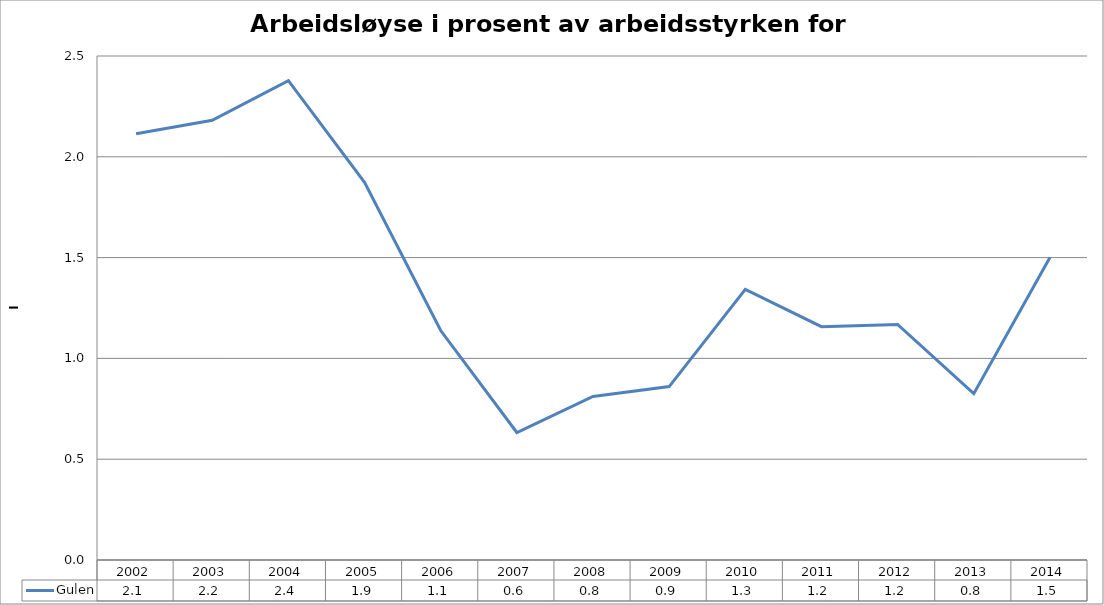
| Category | Gulen |
|---|---|
| 2002.0 | 2.114 |
| 2003.0 | 2.181 |
| 2004.0 | 2.378 |
| 2005.0 | 1.873 |
| 2006.0 | 1.138 |
| 2007.0 | 0.632 |
| 2008.0 | 0.811 |
| 2009.0 | 0.86 |
| 2010.0 | 1.342 |
| 2011.0 | 1.157 |
| 2012.0 | 1.168 |
| 2013.0 | 0.825 |
| 2014.0 | 1.5 |